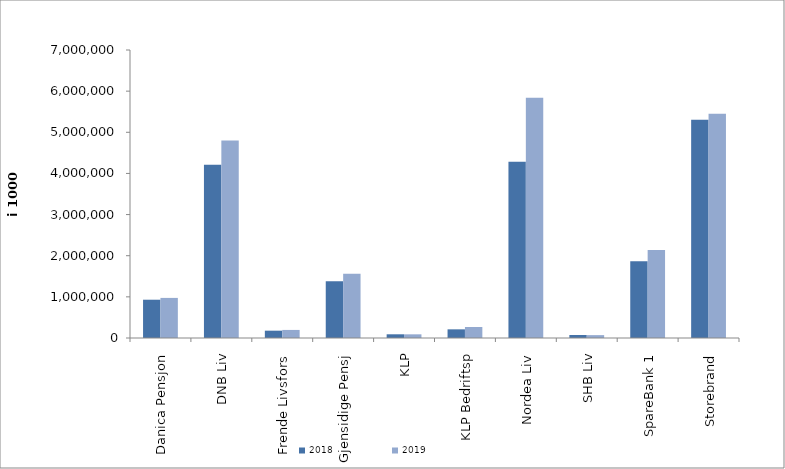
| Category | 2018 | 2019 |
|---|---|---|
| Danica Pensjon | 930551.388 | 974428.506 |
| DNB Liv | 4208747 | 4802393.843 |
| Frende Livsfors | 178093 | 196043 |
| Gjensidige Pensj | 1378089 | 1561713.2 |
| KLP | 90028.571 | 89130.341 |
| KLP Bedriftsp | 210392 | 267105 |
| Nordea Liv | 4286493.912 | 5841396.803 |
| SHB Liv | 73667 | 69806.938 |
| SpareBank 1 | 1866273.11 | 2141160.639 |
| Storebrand | 5304820.942 | 5450501.313 |